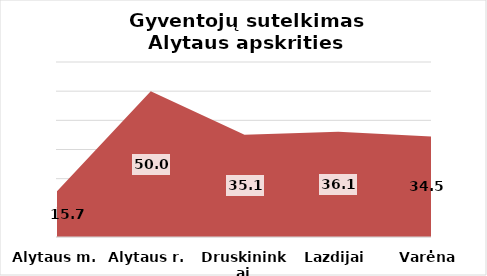
| Category | Series 0 |
|---|---|
| Alytaus m. | 15.72 |
| Alytaus r. | 50 |
| Druskininkai | 35.06 |
| Lazdijai | 36.05 |
| Varėna | 34.47 |